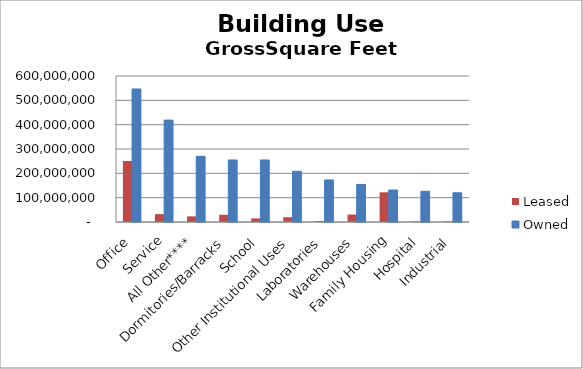
| Category | Leased | Owned |
|---|---|---|
| Office | 250702991.86 | 546884254.25 |
| Service | 32447215.1 | 418744774.698 |
| All Other**** | 23136405.76 | 269917077.426 |
| Dormitories/Barracks | 29757903.13 | 254953335.466 |
| School | 14747276.34 | 254922254.246 |
| Other Institutional Uses | 19835341.11 | 208518580.869 |
| Laboratories | 4158602 | 172742192.595 |
| Warehouses | 30753251 | 154347991.595 |
| Family Housing | 122055007.65 | 131423464.815 |
| Hospital | 1998025 | 126366565.35 |
| Industrial | 2434236.04 | 120140238.612 |